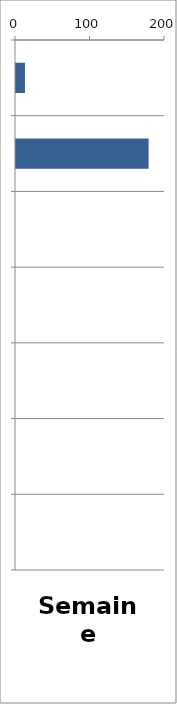
| Category | PL |
|---|---|
| 0 | 12 |
| 1 | 178 |
| 2 | 0 |
| 3 | 0 |
| 4 | 0 |
| 5 | 0 |
| 6 | 0 |